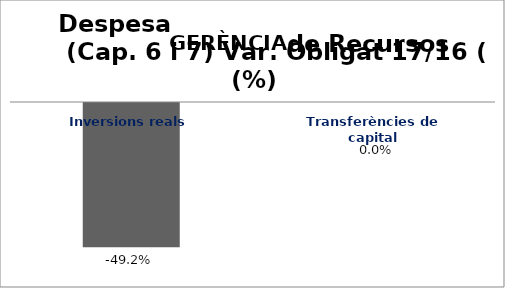
| Category | Series 0 |
|---|---|
| Inversions reals | -0.492 |
| Transferències de capital | 0 |